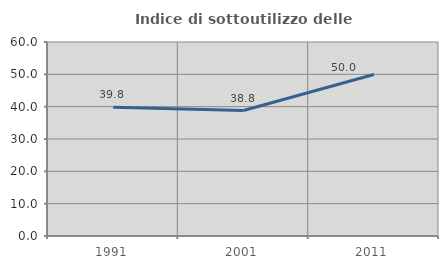
| Category | Indice di sottoutilizzo delle abitazioni  |
|---|---|
| 1991.0 | 39.82 |
| 2001.0 | 38.798 |
| 2011.0 | 49.953 |